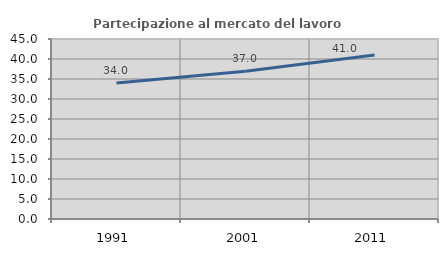
| Category | Partecipazione al mercato del lavoro  femminile |
|---|---|
| 1991.0 | 33.975 |
| 2001.0 | 36.954 |
| 2011.0 | 40.993 |